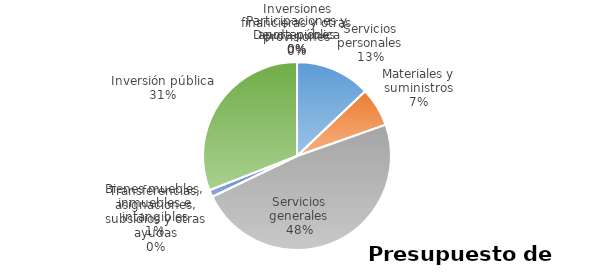
| Category | Series 0 | Series 1 | Series 2 | Series 3 | Series 4 | Series 5 |
|---|---|---|---|---|---|---|
| Servicios personales | 6389414 |  |  |  |  |  |
| Materiales y suministros | 3313918 |  |  |  |  |  |
| Servicios generales | 23900905 |  |  |  |  |  |
| Transferencias, asignaciones, subsidios y otras ayudas | 0 |  |  |  |  |  |
| Bienes muebles, inmuebles e intangibles | 600000 |  |  |  |  |  |
| Inversión pública | 15317500 |  |  |  |  |  |
| Inversiones financieras y otras provisiones | 0 |  |  |  |  |  |
| Participaciones y aportaciones | 0 |  |  |  |  |  |
| Deuda pública | 0 |  |  |  |  |  |